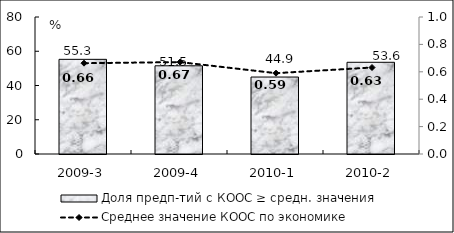
| Category | Доля предп-тий с КООС ≥ средн. значения  |
|---|---|
| 2009-3 | 55.28 |
| 2009-4 | 51.5 |
| 2010-1 | 44.94 |
| 2010-2 | 53.55 |